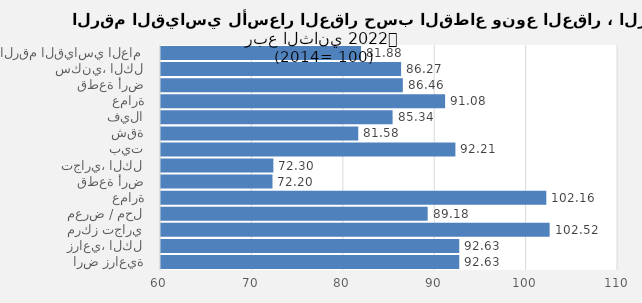
| Category | 2022 الربع الثاني  |
|---|---|
| الرقم القياسي العام | 81.879 |
| سكني، الكل | 86.272 |
| قطعة أرض | 86.458 |
| عمارة | 91.084 |
| فيلا | 85.339 |
| شقة | 81.581 |
| بيت | 92.21 |
| تجاري، الكل | 72.295 |
| قطعة أرض | 72.196 |
| عمارة | 102.156 |
| معرض / محل | 89.176 |
| مركز تجاري | 102.521 |
| زراعي، الكل | 92.633 |
| ارض زراعية | 92.633 |